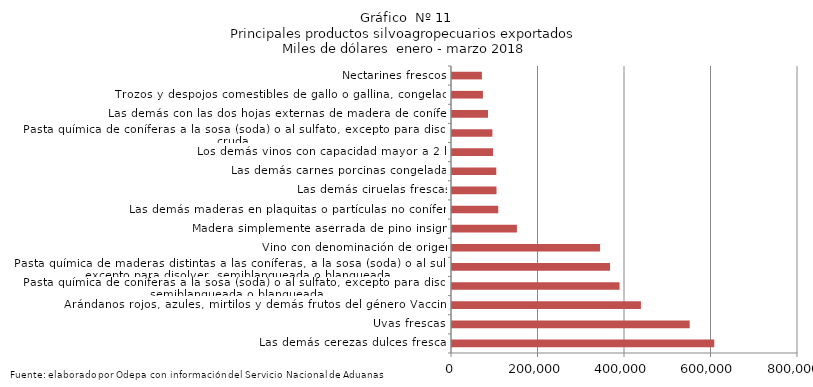
| Category | Series 0 |
|---|---|
| Las demás cerezas dulces frescas | 606345.325 |
| Uvas frescas | 549548.803 |
| Arándanos rojos, azules, mirtilos y demás frutos del género Vaccinium | 436830.211 |
| Pasta química de coníferas a la sosa (soda) o al sulfato, excepto para disolver, semiblanqueada o blanqueada | 387471.794 |
| Pasta química de maderas distintas a las coníferas, a la sosa (soda) o al sulfato, excepto para disolver, semiblanqueada o blanqueada | 365477.574 |
| Vino con denominación de origen | 342390.365 |
| Madera simplemente aserrada de pino insigne | 150055.238 |
| Las demás maderas en plaquitas o partículas no coníferas | 106943.564 |
| Las demás ciruelas frescas | 102874.728 |
| Las demás carnes porcinas congeladas | 102397.51 |
| Los demás vinos con capacidad mayor a 2 lts | 94816.9 |
| Pasta química de coníferas a la sosa (soda) o al sulfato, excepto para disolver, cruda | 93370.189 |
| Las demás con las dos hojas externas de madera de coníferas | 83299.894 |
| Trozos y despojos comestibles de gallo o gallina, congelados | 71493.274 |
| Nectarines frescos | 69162.915 |